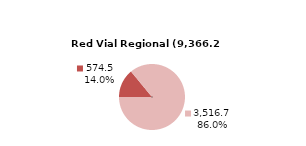
| Category | RV Departamental |
|---|---|
| Pavimentada | 574.532 |
| No Pavimentada | 3516.687 |